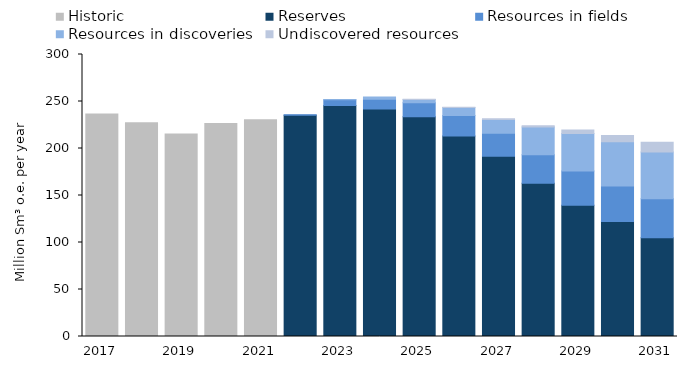
| Category | Historic | Reserves | Resources in fields | Resources in discoveries | Undiscovered resources |
|---|---|---|---|---|---|
| 2017.0 | 236.75 | 0 | 0 | 0 | 0 |
| 2018.0 | 227.33 | 0 | 0 | 0 | 0 |
| 2019.0 | 215.32 | 0 | 0 | 0 | 0 |
| 2020.0 | 226.64 | 0 | 0 | 0 | 0 |
| 2021.0 | 230.56 | 0 | 0 | 0 | 0 |
| 2022.0 | 0 | 235.24 | 0.73 | 0 | 0 |
| 2023.0 | 0 | 245.73 | 6.13 | 0.03 | 0 |
| 2024.0 | 0 | 242 | 10.28 | 2.62 | 0 |
| 2025.0 | 0 | 233.84 | 14.91 | 3.49 | 0.04 |
| 2026.0 | 0 | 213.42 | 21.63 | 8.54 | 0.19 |
| 2027.0 | 0 | 191.67 | 24.43 | 14.79 | 0.77 |
| 2028.0 | 0 | 162.95 | 30.38 | 29.41 | 1.59 |
| 2029.0 | 0 | 139.61 | 36.42 | 39.86 | 3.9 |
| 2030.0 | 0 | 122.32 | 37.87 | 46.96 | 6.62 |
| 2031.0 | 0 | 105.15 | 41.51 | 49.68 | 10.27 |